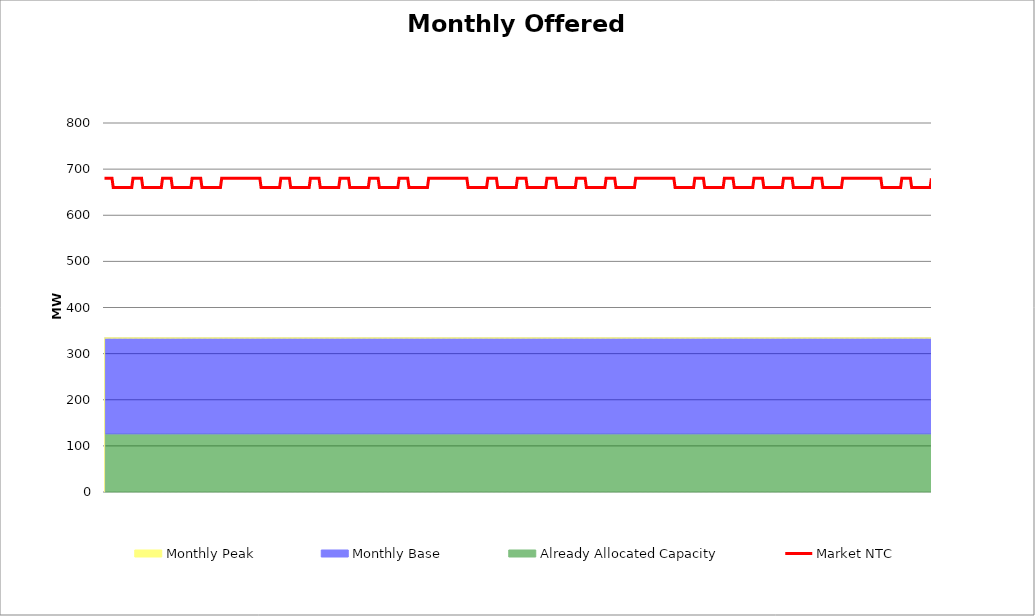
| Category | Market NTC |
|---|---|
| 0 | 680 |
| 1 | 680 |
| 2 | 680 |
| 3 | 680 |
| 4 | 680 |
| 5 | 680 |
| 6 | 680 |
| 7 | 660 |
| 8 | 660 |
| 9 | 660 |
| 10 | 660 |
| 11 | 660 |
| 12 | 660 |
| 13 | 660 |
| 14 | 660 |
| 15 | 660 |
| 16 | 660 |
| 17 | 660 |
| 18 | 660 |
| 19 | 660 |
| 20 | 660 |
| 21 | 660 |
| 22 | 660 |
| 23 | 680 |
| 24 | 680 |
| 25 | 680 |
| 26 | 680 |
| 27 | 680 |
| 28 | 680 |
| 29 | 680 |
| 30 | 680 |
| 31 | 660 |
| 32 | 660 |
| 33 | 660 |
| 34 | 660 |
| 35 | 660 |
| 36 | 660 |
| 37 | 660 |
| 38 | 660 |
| 39 | 660 |
| 40 | 660 |
| 41 | 660 |
| 42 | 660 |
| 43 | 660 |
| 44 | 660 |
| 45 | 660 |
| 46 | 660 |
| 47 | 680 |
| 48 | 680 |
| 49 | 680 |
| 50 | 680 |
| 51 | 680 |
| 52 | 680 |
| 53 | 680 |
| 54 | 680 |
| 55 | 660 |
| 56 | 660 |
| 57 | 660 |
| 58 | 660 |
| 59 | 660 |
| 60 | 660 |
| 61 | 660 |
| 62 | 660 |
| 63 | 660 |
| 64 | 660 |
| 65 | 660 |
| 66 | 660 |
| 67 | 660 |
| 68 | 660 |
| 69 | 660 |
| 70 | 660 |
| 71 | 680 |
| 72 | 680 |
| 73 | 680 |
| 74 | 680 |
| 75 | 680 |
| 76 | 680 |
| 77 | 680 |
| 78 | 680 |
| 79 | 660 |
| 80 | 660 |
| 81 | 660 |
| 82 | 660 |
| 83 | 660 |
| 84 | 660 |
| 85 | 660 |
| 86 | 660 |
| 87 | 660 |
| 88 | 660 |
| 89 | 660 |
| 90 | 660 |
| 91 | 660 |
| 92 | 660 |
| 93 | 660 |
| 94 | 660 |
| 95 | 680 |
| 96 | 680 |
| 97 | 680 |
| 98 | 680 |
| 99 | 680 |
| 100 | 680 |
| 101 | 680 |
| 102 | 680 |
| 103 | 680 |
| 104 | 680 |
| 105 | 680 |
| 106 | 680 |
| 107 | 680 |
| 108 | 680 |
| 109 | 680 |
| 110 | 680 |
| 111 | 680 |
| 112 | 680 |
| 113 | 680 |
| 114 | 680 |
| 115 | 680 |
| 116 | 680 |
| 117 | 680 |
| 118 | 680 |
| 119 | 680 |
| 120 | 680 |
| 121 | 680 |
| 122 | 680 |
| 123 | 680 |
| 124 | 680 |
| 125 | 680 |
| 126 | 680 |
| 127 | 660 |
| 128 | 660 |
| 129 | 660 |
| 130 | 660 |
| 131 | 660 |
| 132 | 660 |
| 133 | 660 |
| 134 | 660 |
| 135 | 660 |
| 136 | 660 |
| 137 | 660 |
| 138 | 660 |
| 139 | 660 |
| 140 | 660 |
| 141 | 660 |
| 142 | 660 |
| 143 | 680 |
| 144 | 680 |
| 145 | 680 |
| 146 | 680 |
| 147 | 680 |
| 148 | 680 |
| 149 | 680 |
| 150 | 680 |
| 151 | 660 |
| 152 | 660 |
| 153 | 660 |
| 154 | 660 |
| 155 | 660 |
| 156 | 660 |
| 157 | 660 |
| 158 | 660 |
| 159 | 660 |
| 160 | 660 |
| 161 | 660 |
| 162 | 660 |
| 163 | 660 |
| 164 | 660 |
| 165 | 660 |
| 166 | 660 |
| 167 | 680 |
| 168 | 680 |
| 169 | 680 |
| 170 | 680 |
| 171 | 680 |
| 172 | 680 |
| 173 | 680 |
| 174 | 680 |
| 175 | 660 |
| 176 | 660 |
| 177 | 660 |
| 178 | 660 |
| 179 | 660 |
| 180 | 660 |
| 181 | 660 |
| 182 | 660 |
| 183 | 660 |
| 184 | 660 |
| 185 | 660 |
| 186 | 660 |
| 187 | 660 |
| 188 | 660 |
| 189 | 660 |
| 190 | 660 |
| 191 | 680 |
| 192 | 680 |
| 193 | 680 |
| 194 | 680 |
| 195 | 680 |
| 196 | 680 |
| 197 | 680 |
| 198 | 680 |
| 199 | 660 |
| 200 | 660 |
| 201 | 660 |
| 202 | 660 |
| 203 | 660 |
| 204 | 660 |
| 205 | 660 |
| 206 | 660 |
| 207 | 660 |
| 208 | 660 |
| 209 | 660 |
| 210 | 660 |
| 211 | 660 |
| 212 | 660 |
| 213 | 660 |
| 214 | 660 |
| 215 | 680 |
| 216 | 680 |
| 217 | 680 |
| 218 | 680 |
| 219 | 680 |
| 220 | 680 |
| 221 | 680 |
| 222 | 680 |
| 223 | 660 |
| 224 | 660 |
| 225 | 660 |
| 226 | 660 |
| 227 | 660 |
| 228 | 660 |
| 229 | 660 |
| 230 | 660 |
| 231 | 660 |
| 232 | 660 |
| 233 | 660 |
| 234 | 660 |
| 235 | 660 |
| 236 | 660 |
| 237 | 660 |
| 238 | 660 |
| 239 | 680 |
| 240 | 680 |
| 241 | 680 |
| 242 | 680 |
| 243 | 680 |
| 244 | 680 |
| 245 | 680 |
| 246 | 680 |
| 247 | 660 |
| 248 | 660 |
| 249 | 660 |
| 250 | 660 |
| 251 | 660 |
| 252 | 660 |
| 253 | 660 |
| 254 | 660 |
| 255 | 660 |
| 256 | 660 |
| 257 | 660 |
| 258 | 660 |
| 259 | 660 |
| 260 | 660 |
| 261 | 660 |
| 262 | 660 |
| 263 | 680 |
| 264 | 680 |
| 265 | 680 |
| 266 | 680 |
| 267 | 680 |
| 268 | 680 |
| 269 | 680 |
| 270 | 680 |
| 271 | 680 |
| 272 | 680 |
| 273 | 680 |
| 274 | 680 |
| 275 | 680 |
| 276 | 680 |
| 277 | 680 |
| 278 | 680 |
| 279 | 680 |
| 280 | 680 |
| 281 | 680 |
| 282 | 680 |
| 283 | 680 |
| 284 | 680 |
| 285 | 680 |
| 286 | 680 |
| 287 | 680 |
| 288 | 680 |
| 289 | 680 |
| 290 | 680 |
| 291 | 680 |
| 292 | 680 |
| 293 | 680 |
| 294 | 680 |
| 295 | 660 |
| 296 | 660 |
| 297 | 660 |
| 298 | 660 |
| 299 | 660 |
| 300 | 660 |
| 301 | 660 |
| 302 | 660 |
| 303 | 660 |
| 304 | 660 |
| 305 | 660 |
| 306 | 660 |
| 307 | 660 |
| 308 | 660 |
| 309 | 660 |
| 310 | 660 |
| 311 | 680 |
| 312 | 680 |
| 313 | 680 |
| 314 | 680 |
| 315 | 680 |
| 316 | 680 |
| 317 | 680 |
| 318 | 680 |
| 319 | 660 |
| 320 | 660 |
| 321 | 660 |
| 322 | 660 |
| 323 | 660 |
| 324 | 660 |
| 325 | 660 |
| 326 | 660 |
| 327 | 660 |
| 328 | 660 |
| 329 | 660 |
| 330 | 660 |
| 331 | 660 |
| 332 | 660 |
| 333 | 660 |
| 334 | 660 |
| 335 | 680 |
| 336 | 680 |
| 337 | 680 |
| 338 | 680 |
| 339 | 680 |
| 340 | 680 |
| 341 | 680 |
| 342 | 680 |
| 343 | 660 |
| 344 | 660 |
| 345 | 660 |
| 346 | 660 |
| 347 | 660 |
| 348 | 660 |
| 349 | 660 |
| 350 | 660 |
| 351 | 660 |
| 352 | 660 |
| 353 | 660 |
| 354 | 660 |
| 355 | 660 |
| 356 | 660 |
| 357 | 660 |
| 358 | 660 |
| 359 | 680 |
| 360 | 680 |
| 361 | 680 |
| 362 | 680 |
| 363 | 680 |
| 364 | 680 |
| 365 | 680 |
| 366 | 680 |
| 367 | 660 |
| 368 | 660 |
| 369 | 660 |
| 370 | 660 |
| 371 | 660 |
| 372 | 660 |
| 373 | 660 |
| 374 | 660 |
| 375 | 660 |
| 376 | 660 |
| 377 | 660 |
| 378 | 660 |
| 379 | 660 |
| 380 | 660 |
| 381 | 660 |
| 382 | 660 |
| 383 | 680 |
| 384 | 680 |
| 385 | 680 |
| 386 | 680 |
| 387 | 680 |
| 388 | 680 |
| 389 | 680 |
| 390 | 680 |
| 391 | 660 |
| 392 | 660 |
| 393 | 660 |
| 394 | 660 |
| 395 | 660 |
| 396 | 660 |
| 397 | 660 |
| 398 | 660 |
| 399 | 660 |
| 400 | 660 |
| 401 | 660 |
| 402 | 660 |
| 403 | 660 |
| 404 | 660 |
| 405 | 660 |
| 406 | 660 |
| 407 | 680 |
| 408 | 680 |
| 409 | 680 |
| 410 | 680 |
| 411 | 680 |
| 412 | 680 |
| 413 | 680 |
| 414 | 680 |
| 415 | 660 |
| 416 | 660 |
| 417 | 660 |
| 418 | 660 |
| 419 | 660 |
| 420 | 660 |
| 421 | 660 |
| 422 | 660 |
| 423 | 660 |
| 424 | 660 |
| 425 | 660 |
| 426 | 660 |
| 427 | 660 |
| 428 | 660 |
| 429 | 660 |
| 430 | 660 |
| 431 | 680 |
| 432 | 680 |
| 433 | 680 |
| 434 | 680 |
| 435 | 680 |
| 436 | 680 |
| 437 | 680 |
| 438 | 680 |
| 439 | 680 |
| 440 | 680 |
| 441 | 680 |
| 442 | 680 |
| 443 | 680 |
| 444 | 680 |
| 445 | 680 |
| 446 | 680 |
| 447 | 680 |
| 448 | 680 |
| 449 | 680 |
| 450 | 680 |
| 451 | 680 |
| 452 | 680 |
| 453 | 680 |
| 454 | 680 |
| 455 | 680 |
| 456 | 680 |
| 457 | 680 |
| 458 | 680 |
| 459 | 680 |
| 460 | 680 |
| 461 | 680 |
| 462 | 680 |
| 463 | 660 |
| 464 | 660 |
| 465 | 660 |
| 466 | 660 |
| 467 | 660 |
| 468 | 660 |
| 469 | 660 |
| 470 | 660 |
| 471 | 660 |
| 472 | 660 |
| 473 | 660 |
| 474 | 660 |
| 475 | 660 |
| 476 | 660 |
| 477 | 660 |
| 478 | 660 |
| 479 | 680 |
| 480 | 680 |
| 481 | 680 |
| 482 | 680 |
| 483 | 680 |
| 484 | 680 |
| 485 | 680 |
| 486 | 680 |
| 487 | 660 |
| 488 | 660 |
| 489 | 660 |
| 490 | 660 |
| 491 | 660 |
| 492 | 660 |
| 493 | 660 |
| 494 | 660 |
| 495 | 660 |
| 496 | 660 |
| 497 | 660 |
| 498 | 660 |
| 499 | 660 |
| 500 | 660 |
| 501 | 660 |
| 502 | 660 |
| 503 | 680 |
| 504 | 680 |
| 505 | 680 |
| 506 | 680 |
| 507 | 680 |
| 508 | 680 |
| 509 | 680 |
| 510 | 680 |
| 511 | 660 |
| 512 | 660 |
| 513 | 660 |
| 514 | 660 |
| 515 | 660 |
| 516 | 660 |
| 517 | 660 |
| 518 | 660 |
| 519 | 660 |
| 520 | 660 |
| 521 | 660 |
| 522 | 660 |
| 523 | 660 |
| 524 | 660 |
| 525 | 660 |
| 526 | 660 |
| 527 | 680 |
| 528 | 680 |
| 529 | 680 |
| 530 | 680 |
| 531 | 680 |
| 532 | 680 |
| 533 | 680 |
| 534 | 680 |
| 535 | 660 |
| 536 | 660 |
| 537 | 660 |
| 538 | 660 |
| 539 | 660 |
| 540 | 660 |
| 541 | 660 |
| 542 | 660 |
| 543 | 660 |
| 544 | 660 |
| 545 | 660 |
| 546 | 660 |
| 547 | 660 |
| 548 | 660 |
| 549 | 660 |
| 550 | 660 |
| 551 | 680 |
| 552 | 680 |
| 553 | 680 |
| 554 | 680 |
| 555 | 680 |
| 556 | 680 |
| 557 | 680 |
| 558 | 680 |
| 559 | 660 |
| 560 | 660 |
| 561 | 660 |
| 562 | 660 |
| 563 | 660 |
| 564 | 660 |
| 565 | 660 |
| 566 | 660 |
| 567 | 660 |
| 568 | 660 |
| 569 | 660 |
| 570 | 660 |
| 571 | 660 |
| 572 | 660 |
| 573 | 660 |
| 574 | 660 |
| 575 | 680 |
| 576 | 680 |
| 577 | 680 |
| 578 | 680 |
| 579 | 680 |
| 580 | 680 |
| 581 | 680 |
| 582 | 680 |
| 583 | 660 |
| 584 | 660 |
| 585 | 660 |
| 586 | 660 |
| 587 | 660 |
| 588 | 660 |
| 589 | 660 |
| 590 | 660 |
| 591 | 660 |
| 592 | 660 |
| 593 | 660 |
| 594 | 660 |
| 595 | 660 |
| 596 | 660 |
| 597 | 660 |
| 598 | 660 |
| 599 | 680 |
| 600 | 680 |
| 601 | 680 |
| 602 | 680 |
| 603 | 680 |
| 604 | 680 |
| 605 | 680 |
| 606 | 680 |
| 607 | 680 |
| 608 | 680 |
| 609 | 680 |
| 610 | 680 |
| 611 | 680 |
| 612 | 680 |
| 613 | 680 |
| 614 | 680 |
| 615 | 680 |
| 616 | 680 |
| 617 | 680 |
| 618 | 680 |
| 619 | 680 |
| 620 | 680 |
| 621 | 680 |
| 622 | 680 |
| 623 | 680 |
| 624 | 680 |
| 625 | 680 |
| 626 | 680 |
| 627 | 680 |
| 628 | 680 |
| 629 | 680 |
| 630 | 680 |
| 631 | 660 |
| 632 | 660 |
| 633 | 660 |
| 634 | 660 |
| 635 | 660 |
| 636 | 660 |
| 637 | 660 |
| 638 | 660 |
| 639 | 660 |
| 640 | 660 |
| 641 | 660 |
| 642 | 660 |
| 643 | 660 |
| 644 | 660 |
| 645 | 660 |
| 646 | 660 |
| 647 | 680 |
| 648 | 680 |
| 649 | 680 |
| 650 | 680 |
| 651 | 680 |
| 652 | 680 |
| 653 | 680 |
| 654 | 680 |
| 655 | 660 |
| 656 | 660 |
| 657 | 660 |
| 658 | 660 |
| 659 | 660 |
| 660 | 660 |
| 661 | 660 |
| 662 | 660 |
| 663 | 660 |
| 664 | 660 |
| 665 | 660 |
| 666 | 660 |
| 667 | 660 |
| 668 | 660 |
| 669 | 660 |
| 670 | 660 |
| 671 | 680 |